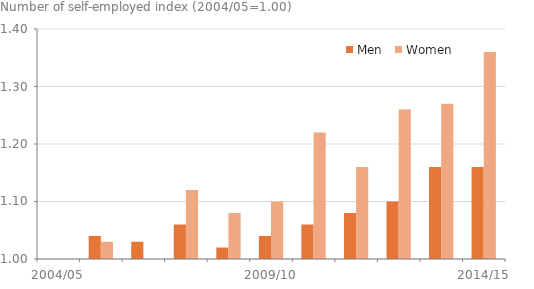
| Category | Men | Women |
|---|---|---|
| 2004/05 | 1 | 1 |
| 2005/06 | 1.04 | 1.03 |
| 2006/07 | 1.03 | 1 |
| 2007/08 | 1.06 | 1.12 |
| 2008/09 | 1.02 | 1.08 |
| 2009/10 | 1.04 | 1.1 |
| 2010/11 | 1.06 | 1.22 |
| 2011/12 | 1.08 | 1.16 |
| 2012/13 | 1.1 | 1.26 |
| 2013/14 | 1.16 | 1.27 |
| 2014/15 | 1.16 | 1.36 |